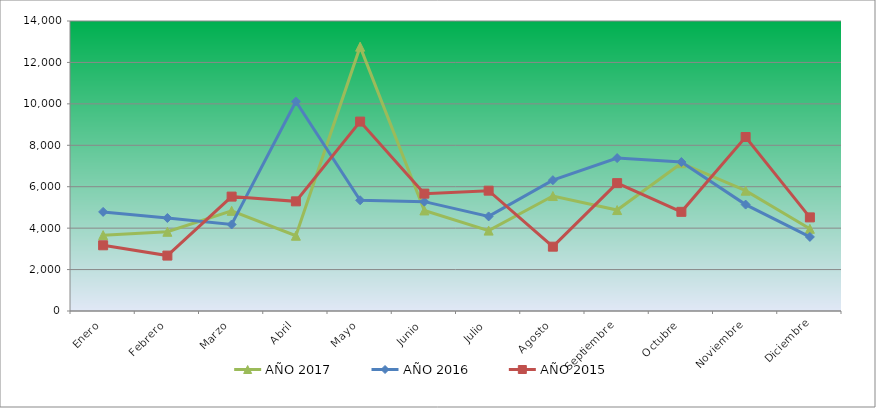
| Category | AÑO 2017 | AÑO 2016 | AÑO 2015 |
|---|---|---|---|
| Enero | 3662.219 | 4784.944 | 3172.387 |
| Febrero | 3824.348 | 4490.047 | 2675.507 |
| Marzo | 4835.273 | 4176.124 | 5523.012 |
| Abril | 3633.608 | 10112.118 | 5293.683 |
| Mayo | 12760.544 | 5346.2 | 9144.502 |
| Junio | 4854.347 | 5279.61 | 5666.343 |
| Julio | 3881.57 | 4566.149 | 5809.673 |
| Agosto | 5550.55 | 6316.506 | 3105.5 |
| Septiembre | 4873.421 | 7381.941 | 6172.778 |
| Octubre | 7133.697 | 7191.685 | 4787.247 |
| Noviembre | 5808.05 | 5136.918 | 8399.182 |
| Diciembre | 3967.404 | 3576.817 | 4519.697 |